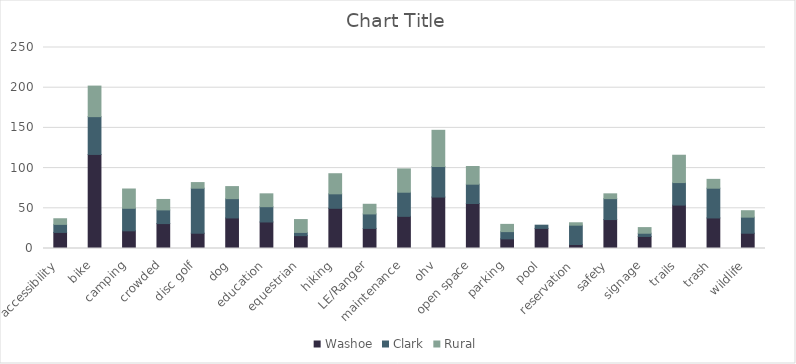
| Category | Washoe | Clark | Rural |
|---|---|---|---|
| accessibility | 20 | 10 | 7 |
| bike | 117 | 47 | 38 |
| camping | 22 | 28 | 24 |
| crowded | 31 | 17 | 13 |
| disc golf | 19 | 56 | 7 |
| dog | 38 | 24 | 15 |
| education | 33 | 19 | 16 |
| equestrian | 16 | 4 | 16 |
| hiking | 50 | 18 | 25 |
| LE/Ranger | 25 | 18 | 12 |
| maintenance | 40 | 30 | 29 |
| ohv | 64 | 38 | 45 |
| open space | 56 | 24 | 22 |
| parking | 12 | 9 | 9 |
| pool | 25 | 4 | 0 |
| reservation | 5 | 24 | 3 |
| safety | 36 | 26 | 6 |
| signage | 15 | 4 | 7 |
| trails | 54 | 28 | 34 |
| trash | 38 | 37 | 11 |
| wildlife | 19 | 20 | 8 |